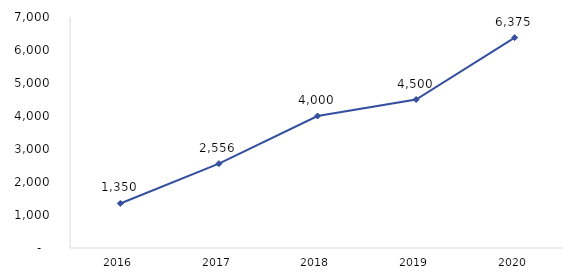
| Category | Series 0 |
|---|---|
| 2016.0 | 1350 |
| 2017.0 | 2555.85 |
| 2018.0 | 4000 |
| 2019.0 | 4500 |
| 2020.0 | 6375 |